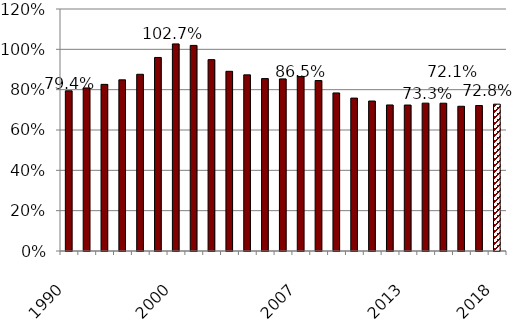
| Category | Series 0 |
|---|---|
| 1990.0 | 0.794 |
| nan | 0.808 |
| nan | 0.826 |
| nan | 0.849 |
| nan | 0.876 |
| nan | 0.96 |
| 2000.0 | 1.027 |
| nan | 1.019 |
| nan | 0.949 |
| nan | 0.891 |
| nan | 0.873 |
| nan | 0.855 |
| nan | 0.853 |
| 2007.0 | 0.865 |
| nan | 0.845 |
| nan | 0.784 |
| nan | 0.758 |
| nan | 0.744 |
| nan | 0.724 |
| 2013.0 | 0.724 |
| nan | 0.733 |
| nan | 0.733 |
| nan | 0.718 |
| nan | 0.721 |
| 2018.0 | 0.728 |